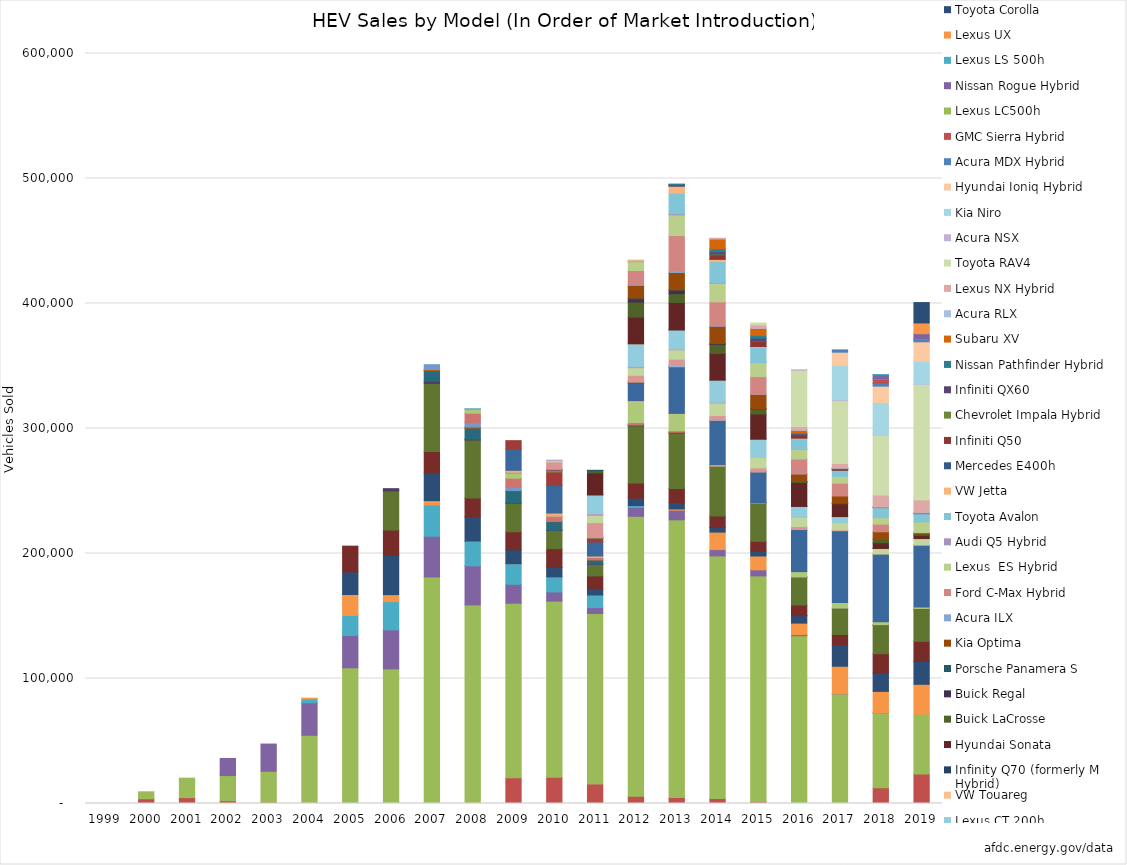
| Category | Honda Insight | Toyota Prius | Honda Civic | Ford Escape/Mercury Mariner | Honda Accord | Toyota Highlander | Lexus RX 450h | Toyota Camry | Lexus GS 450h | Nissan Altima | Lexus LS 600hL | Saturn Vue | Tahoe, Yukon, Escalade | Chevrolet Malibu | Saturn Aura | Aspen & Durango | Silverado & Sierra | Ford Fusion & Milan | Lexus HS 250h | Mercedes S400 | Mercedes ML450 | Mercedes E320 | Mazda Tribute | BMW X6 & Activehybrid 3&5&7 | Honda CR-z | Lincoln MKZ | Porsche Cayenne | Lexus CT 200h | VW Touareg | Infinity Q70 (formerly M Hybrid) | Hyundai Sonata | Buick LaCrosse | Buick Regal | Porsche Panamera S | Kia Optima | Acura ILX | Ford C-Max Hybrid | Lexus  ES Hybrid | Audi Q5 Hybrid | Toyota Avalon | VW Jetta | Mercedes E400h | Infiniti Q50 | Chevrolet Impala Hybrid | Infiniti QX60 | Nissan Pathfinder Hybrid | Subaru XV | Acura RLX | Lexus NX Hybrid | Toyota RAV4 | Acura NSX | Kia Niro | Hyundai Ioniq Hybrid | Acura MDX Hybrid | GMC Sierra Hybrid | Lexus LC500h | Nissan Rogue Hybrid | Lexus LS 500h | Lexus UX | Toyota Corolla |
|---|---|---|---|---|---|---|---|---|---|---|---|---|---|---|---|---|---|---|---|---|---|---|---|---|---|---|---|---|---|---|---|---|---|---|---|---|---|---|---|---|---|---|---|---|---|---|---|---|---|---|---|---|---|---|---|---|---|---|---|---|
| 1999.0 | 17 | 0 | 0 | 0 | 0 | 0 | 0 | 0 | 0 | 0 | 0 | 0 | 0 | 0 | 0 | 0 | 0 | 0 | 0 | 0 | 0 | 0 | 0 | 0 | 0 | 0 | 0 | 0 | 0 | 0 | 0 | 0 | 0 | 0 | 0 | 0 | 0 | 0 | 0 | 0 | 0 | 0 | 0 | 0 | 0 | 0 | 0 | 0 | 0 | 0 | 0 | 0 | 0 | 0 | 0 | 0 | 0 | 0 | 0 | 0 |
| 2000.0 | 3788 | 5562 | 0 | 0 | 0 | 0 | 0 | 0 | 0 | 0 | 0 | 0 | 0 | 0 | 0 | 0 | 0 | 0 | 0 | 0 | 0 | 0 | 0 | 0 | 0 | 0 | 0 | 0 | 0 | 0 | 0 | 0 | 0 | 0 | 0 | 0 | 0 | 0 | 0 | 0 | 0 | 0 | 0 | 0 | 0 | 0 | 0 | 0 | 0 | 0 | 0 | 0 | 0 | 0 | 0 | 0 | 0 | 0 | 0 | 0 |
| 2001.0 | 4726 | 15556 | 0 | 0 | 0 | 0 | 0 | 0 | 0 | 0 | 0 | 0 | 0 | 0 | 0 | 0 | 0 | 0 | 0 | 0 | 0 | 0 | 0 | 0 | 0 | 0 | 0 | 0 | 0 | 0 | 0 | 0 | 0 | 0 | 0 | 0 | 0 | 0 | 0 | 0 | 0 | 0 | 0 | 0 | 0 | 0 | 0 | 0 | 0 | 0 | 0 | 0 | 0 | 0 | 0 | 0 | 0 | 0 | 0 | 0 |
| 2002.0 | 2216 | 20119 | 13707 | 0 | 0 | 0 | 0 | 0 | 0 | 0 | 0 | 0 | 0 | 0 | 0 | 0 | 0 | 0 | 0 | 0 | 0 | 0 | 0 | 0 | 0 | 0 | 0 | 0 | 0 | 0 | 0 | 0 | 0 | 0 | 0 | 0 | 0 | 0 | 0 | 0 | 0 | 0 | 0 | 0 | 0 | 0 | 0 | 0 | 0 | 0 | 0 | 0 | 0 | 0 | 0 | 0 | 0 | 0 | 0 | 0 |
| 2003.0 | 1168 | 24627 | 21771 | 0 | 0 | 0 | 0 | 0 | 0 | 0 | 0 | 0 | 0 | 0 | 0 | 0 | 0 | 0 | 0 | 0 | 0 | 0 | 0 | 0 | 0 | 0 | 0 | 0 | 0 | 0 | 0 | 0 | 0 | 0 | 0 | 0 | 0 | 0 | 0 | 0 | 0 | 0 | 0 | 0 | 0 | 0 | 0 | 0 | 0 | 0 | 0 | 0 | 0 | 0 | 0 | 0 | 0 | 0 | 0 | 0 |
| 2004.0 | 583 | 53991 | 26013 | 2993 | 653 | 0 | 0 | 0 | 0 | 0 | 0 | 0 | 0 | 0 | 0 | 0 | 0 | 0 | 0 | 0 | 0 | 0 | 0 | 0 | 0 | 0 | 0 | 0 | 0 | 0 | 0 | 0 | 0 | 0 | 0 | 0 | 0 | 0 | 0 | 0 | 0 | 0 | 0 | 0 | 0 | 0 | 0 | 0 | 0 | 0 | 0 | 0 | 0 | 0 | 0 | 0 | 0 | 0 | 0 | 0 |
| 2005.0 | 666 | 107897 | 25864 | 15960 | 16826 | 17989 | 20674 | 0 | 0 | 0 | 0 | 0 | 0 | 0 | 0 | 0 | 0 | 0 | 0 | 0 | 0 | 0 | 0 | 0 | 0 | 0 | 0 | 0 | 0 | 0 | 0 | 0 | 0 | 0 | 0 | 0 | 0 | 0 | 0 | 0 | 0 | 0 | 0 | 0 | 0 | 0 | 0 | 0 | 0 | 0 | 0 | 0 | 0 | 0 | 0 | 0 | 0 | 0 | 0 | 0 |
| 2006.0 | 722 | 106971 | 31253 | 22549 | 5598 | 31485 | 20161 | 31341 | 1784 | 0 | 0 | 0 | 0 | 0 | 0 | 0 | 0 | 0 | 0 | 0 | 0 | 0 | 0 | 0 | 0 | 0 | 0 | 0 | 0 | 0 | 0 | 0 | 0 | 0 | 0 | 0 | 0 | 0 | 0 | 0 | 0 | 0 | 0 | 0 | 0 | 0 | 0 | 0 | 0 | 0 | 0 | 0 | 0 | 0 | 0 | 0 | 0 | 0 | 0 | 0 |
| 2007.0 | 3 | 181221 | 32575 | 25108 | 3405 | 22052 | 17291 | 54477 | 1645 | 8388 | 937 | 3969 | 0 | 0 | 0 | 0 | 0 | 0 | 0 | 0 | 0 | 0 | 0 | 0 | 0 | 0 | 0 | 0 | 0 | 0 | 0 | 0 | 0 | 0 | 0 | 0 | 0 | 0 | 0 | 0 | 0 | 0 | 0 | 0 | 0 | 0 | 0 | 0 | 0 | 0 | 0 | 0 | 0 | 0 | 0 | 0 | 0 | 0 | 0 | 0 |
| 2008.0 | 0 | 158886 | 31297 | 19522 | 198 | 19391 | 15200 | 46272 | 678 | 8819 | 980 | 3399 | 7612 | 3118 | 310 | 81 | 0 | 0 | 0 | 0 | 0 | 0 | 0 | 0 | 0 | 0 | 0 | 0 | 0 | 0 | 0 | 0 | 0 | 0 | 0 | 0 | 0 | 0 | 0 | 0 | 0 | 0 | 0 | 0 | 0 | 0 | 0 | 0 | 0 | 0 | 0 | 0 | 0 | 0 | 0 | 0 | 0 | 0 | 0 | 0 |
| 2009.0 | 20572 | 139682 | 15119 | 16480 | 1 | 11086 | 14464 | 22887 | 469 | 9357 | 258 | 2656 | 7192 | 4162 | 527 | 42 | 1598 | 17022 | 6699 | 0 | 0 | 0 | 0 | 0 | 0 | 0 | 0 | 0 | 0 | 0 | 0 | 0 | 0 | 0 | 0 | 0 | 0 | 0 | 0 | 0 | 0 | 0 | 0 | 0 | 0 | 0 | 0 | 0 | 0 | 0 | 0 | 0 | 0 | 0 | 0 | 0 | 0 | 0 | 0 | 0 |
| 2010.0 | 20962 | 140928 | 7336 | 12088 | 0 | 7456 | 15119 | 14587 | 305 | 6710 | 129 | 50 | 3857 | 405 | 55 | 0 | 2393 | 22232 | 10663 | 955 | 766 | 0 | 655 | 350 | 5249 | 1192 | 206 | 0 | 0 | 0 | 0 | 0 | 0 | 0 | 0 | 0 | 0 | 0 | 0 | 0 | 0 | 0 | 0 | 0 | 0 | 0 | 0 | 0 | 0 | 0 | 0 | 0 | 0 | 0 | 0 | 0 | 0 | 0 | 0 | 0 |
| 2011.0 | 15549 | 136463 | 4703 | 10089 | 0 | 4549 | 10723 | 9241 | 282 | 3236 | 85 | 0 | 1877 | 24 | 0 | 0 | 1165 | 11286 | 2864 | 309 | 1 | 59 | 484 | 381 | 11330 | 5739 | 1571 | 14381 | 390 | 378 | 17366 | 1801 | 123 | 52 | 0 | 0 | 0 | 0 | 0 | 0 | 0 | 0 | 0 | 0 | 0 | 0 | 0 | 0 | 0 | 0 | 0 | 0 | 0 | 0 | 0 | 0 | 0 | 0 | 0 | 0 |
| 2012.0 | 5846 | 223906 | 7156 | 1441 | 0 | 5921 | 12223 | 45656 | 607 | 103 | 54 | 0 | 1801 | 16664 | 0 | 0 | 940 | 14100 | 650 | 121 | 22 | 0 | 90 | 1040 | 4192 | 6067 | 1180 | 17671 | 250 | 691 | 20754 | 12010 | 2564 | 570 | 10245 | 972 | 10935 | 7027 | 270 | 747 | 162 | 0 | 0 | 0 | 0 | 0 | 0 | 0 | 0 | 0 | 0 | 0 | 0 | 0 | 0 | 0 | 0 | 0 | 0 | 0 |
| 2013.0 | 4802 | 222140 | 7719 | 0 | 996 | 5070 | 11307 | 44448 | 522 | 0 | 115 | 0 | 1036 | 13779 | 0 | 0 | 169 | 37270 | 5 | 64 | 11 | 0 | 0 | 1456 | 4550 | 7469 | 615 | 15071 | 118 | 475 | 21559 | 7133 | 2893 | 113 | 13919 | 1461 | 28056 | 16562 | 854 | 16468 | 5655 | 282 | 307 | 56 | 676 | 334 | 0 | 0 | 0 | 0 | 0 | 0 | 0 | 0 | 0 | 0 | 0 | 0 | 0 | 0 |
| 2014.0 | 3965 | 194108 | 5070 | 0 | 13977 | 3621 | 9351 | 39515 | 183 | 0 | 65 | 0 | 137 | 1018 | 0 | 0 | 30 | 35425 | 0 | 10 | 20 | 0 | 0 | 308 | 3562 | 10033 | 650 | 17673 | 30 | 180 | 21052 | 7353 | 662 | 0 | 13776 | 379 | 19162 | 14837 | 283 | 17048 | 1939 | 158 | 3456 | 565 | 1678 | 2480 | 7926 | 133 | 354 | 0 | 0 | 0 | 0 | 0 | 0 | 0 | 0 | 0 | 0 | 0 |
| 2015.0 | 1458 | 180603 | 4887 | 0 | 11065 | 4015 | 7722 | 30640 | 91 | 0 | 47 | 0 | 25 | 59 | 0 | 0 | 3 | 24681 | 0 | 1 | 10 | 0 | 0 | 63 | 3073 | 8403 | 0 | 14657 | 16 | 176 | 19908 | 4042 | 186 | 0 | 11492 | 22 | 14177 | 11241 | 97 | 11956 | 740 | 53 | 4012 | 272 | 2356 | 2245 | 5589 | 250 | 2573 | 1494 | 0 | 0 | 0 | 0 | 0 | 0 | 0 | 0 | 0 | 0 |
| 2016.0 | 75 | 134155 | 896 | 0 | 9179 | 5976 | 8561 | 22227 | 70 | 0 | 40 | 0 | 0 | 4335 | 0 | 0 | 0 | 33648 | 0 | 0 | 0 | 0 | 0 | 64 | 2338 | 7219 | 0 | 8903 | 1 | 118 | 18961 | 765 | 45 | 0 | 6142 | 1 | 11877 | 7645 | 18 | 8451 | 709 | 14 | 1998 | 35 | 1114 | 816 | 2173 | 199 | 2842 | 45070 | 269 | 0 | 0 | 0 | 0 | 0 | 0 | 0 | 0 | 0 |
| 2017.0 | 3 | 87725 | 65 | 0 | 22008 | 16864 | 8568 | 20985 | 50 | 0 | 0 | 0 | 0 | 4452 | 0 | 0 | 1 | 57474 | 0 | 0 | 0 | 0 | 0 | 0 | 705 | 5931 | 0 | 4690 | 0 | 58 | 10338 | 506 | 6 | 0 | 5589 | 0 | 10221 | 5394 | 0 | 4990 | 70 | 3 | 870 | 1 | 298 | 389 | 45 | 292 | 3323 | 50559 | 581 | 27237 | 10770 | 1807 | 0 | 0 | 0 | 0 | 0 | 0 |
| 2018.0 | 12510 | 59995 | 6 | 0 | 17188 | 14513 | 15656 | 22914 | 40 | 0 | 211 | 0 | 0 | 2447 | 0 | 0 | 0 | 54157 | 0 | 0 | 0 | 0 | 0 | 0 | 38 | 4407 | 0 | 4 | 0 | 22 | 4526 | 2809 | 0 | 0 | 5924 | 0 | 6101 | 5250 | 0 | 8008 | 1 | 0 | 300 | 0 | 0 | 0 | 0 | 690 | 9062 | 48122 | 170 | 25743 | 13068 | 2106 | 3643 | 102 | 3363 | 123 | 0 | 0 |
| 2019.0 | 23686 | 47862 | 0 | 0 | 23817 | 18248 | 16116 | 26043 | 7 | 0 | 187 | 0 | 0 | 1237 | 0 | 0 | 0 | 49603 | 0 | 0 | 0 | 0 | 0 | 0 | 2 | 5147 | 0 | 0 | 0 | 0 | 2636 | 1057 | 0 | 0 | 1054 | 0 | 38 | 8608 | 0 | 6552 | 0 | 0 | 129 | 0 | 0 | 0 | 572 | 451 | 9649 | 92525 | 238 | 18336 | 15558 | 2130 | 114 | 37 | 4205 | 0 | 8603 | 16299 |